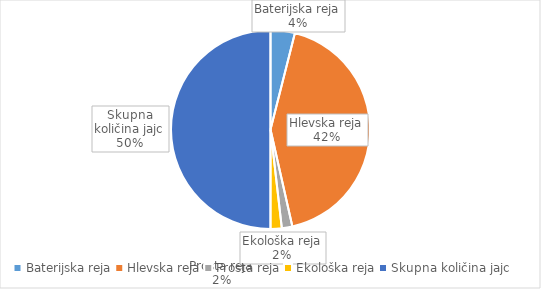
| Category | Količina kosov jajc |
|---|---|
| Baterijska reja | 263845 |
| Hlevska reja | 2840570 |
| Prosta reja | 114270 |
| Ekološka reja | 121699 |
| Skupna količina jajc | 3340384 |